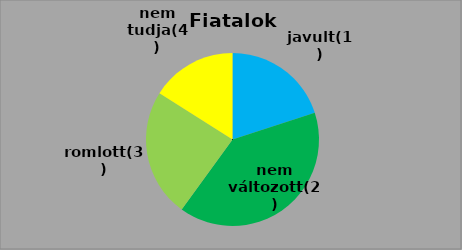
| Category | Series 0 | Series 1 |
|---|---|---|
| javult(1) | 5 | 20 |
| nem változott(2) | 10 | 40 |
| romlott(3) | 6 | 24 |
| nem tudja(4) | 4 | 16 |